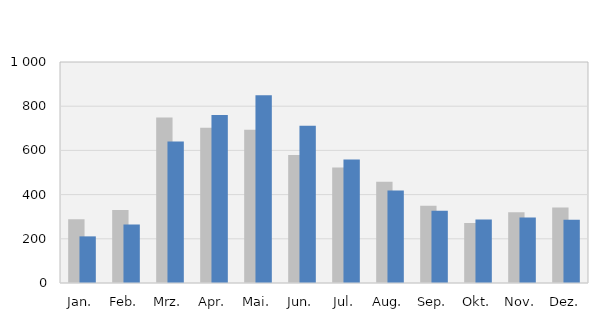
| Category | 2017 | 2018 |
|---|---|---|
| Jan. | 289 | 211 |
| Feb. | 330 | 265 |
| Mrz. | 749 | 640 |
| Apr. | 703 | 760 |
| Mai. | 693 | 850 |
| Jun. | 579 | 712 |
| Jul. | 523 | 559 |
| Aug. | 458 | 418 |
| Sep. | 350 | 327 |
| Okt. | 271 | 287 |
| Nov. | 320 | 296 |
| Dez. | 342 | 286 |